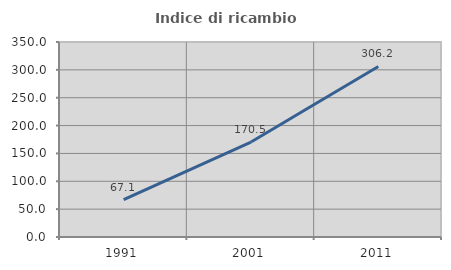
| Category | Indice di ricambio occupazionale  |
|---|---|
| 1991.0 | 67.059 |
| 2001.0 | 170.455 |
| 2011.0 | 306.173 |